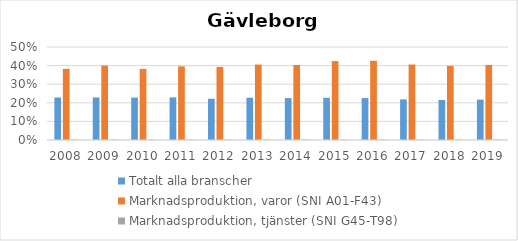
| Category | Totalt alla branscher | Marknadsproduktion, varor (SNI A01-F43) | Marknadsproduktion, tjänster (SNI G45-T98) |
|---|---|---|---|
| 2008 | 0.229 | 0.383 | 0.002 |
| 2009 | 0.229 | 0.4 | 0.002 |
| 2010 | 0.228 | 0.382 | 0.002 |
| 2011 | 0.229 | 0.396 | 0.002 |
| 2012 | 0.222 | 0.393 | 0.002 |
| 2013 | 0.227 | 0.406 | 0.003 |
| 2014 | 0.225 | 0.403 | 0.003 |
| 2015 | 0.227 | 0.424 | 0.003 |
| 2016 | 0.225 | 0.426 | 0.003 |
| 2017 | 0.218 | 0.406 | 0.003 |
| 2018 | 0.215 | 0.398 | 0.002 |
| 2019 | 0.217 | 0.403 | 0.002 |